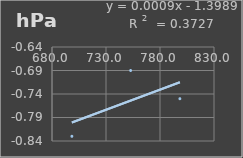
| Category | Presión Atmosférica |
|---|---|
| 698.4 | -0.83 |
| 752.8 | -0.69 |
| 798.4 | -0.75 |